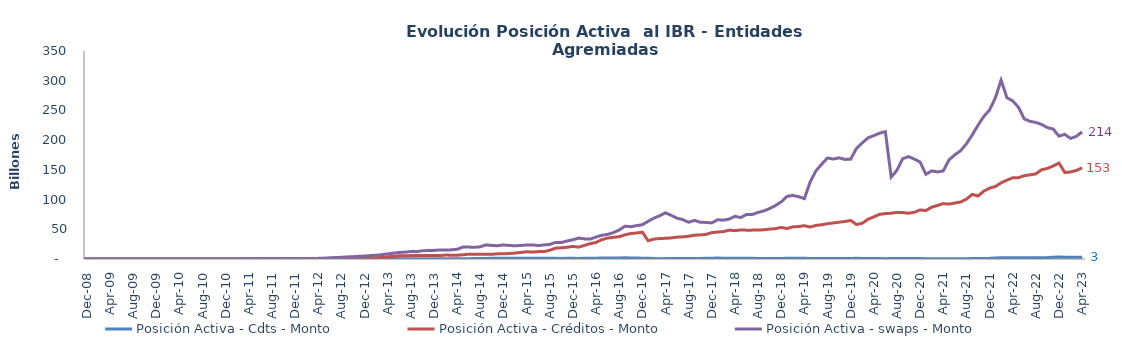
| Category | Posición Activa - Cdts - Monto | Posición Activa - Créditos - Monto | Posición Activa - swaps - Monto |
|---|---|---|---|
| 2008-07-01 | 0 | 0 | 0 |
| 2008-08-01 | 0 | 0 | 0 |
| 2008-09-01 | 0 | 0 | 0 |
| 2008-10-01 | 0 | 0 | 0 |
| 2008-11-01 | 0 | 0 | 0 |
| 2008-12-01 | 0 | 0 | 0 |
| 2009-01-01 | 0 | 0 | 0 |
| 2009-02-01 | 7428500000 | 0 | 0 |
| 2009-03-01 | 7428500000 | 0 | 0 |
| 2009-04-01 | 7428500000 | 0 | 0 |
| 2009-05-01 | 7428500000 | 0 | 0 |
| 2009-06-01 | 7428500000 | 0 | 0 |
| 2009-07-01 | 7428500000 | 0 | 0 |
| 2009-08-01 | 7428500000 | 0 | 0 |
| 2009-09-01 | 7428500000 | 0 | 0 |
| 2009-10-01 | 7928500000 | 0 | 0 |
| 2009-11-01 | 22928500000 | 0 | 0 |
| 2009-12-01 | 22928500000 | 0 | 0 |
| 2010-01-01 | 22928500000 | 0 | 400000000 |
| 2010-02-01 | 22928500000 | 0 | 400000000 |
| 2010-03-01 | 22928500000 | 0 | 1300000000 |
| 2010-04-01 | 22928500000 | 0 | 9300000000 |
| 2010-05-01 | 22928500000 | 0 | 24000000000 |
| 2010-06-01 | 22928500000 | 0 | 35000000000 |
| 2010-07-01 | 22928500000 | 0 | 49000000000 |
| 2010-08-01 | 15500000000 | 0 | 51000000000 |
| 2010-09-01 | 15500000000 | 0 | 42000000000 |
| 2010-10-01 | 62500000000 | 0 | 41000000000 |
| 2010-11-01 | 79500000000 | 0 | 29000000000 |
| 2010-12-01 | 81500000000 | 0 | 22000000000 |
| 2011-01-01 | 86000000000 | 0 | 23500000000 |
| 2011-02-01 | 134000000000 | 0 | 79500000000 |
| 2011-03-01 | 251400000000 | 0 | 114500000000 |
| 2011-04-01 | 282400000000 | 0 | 212500000000 |
| 2011-05-01 | 311900000000 | 0 | 246500000000 |
| 2011-06-01 | 450924000000 | 0 | 280500000000 |
| 2011-07-01 | 628924000000 | 0 | 307500000000 |
| 2011-08-01 | 650424000000 | 0 | 496500000000 |
| 2011-09-01 | 590324000000 | 0 | 493500000000 |
| 2011-10-01 | 571324000000 | 0 | 503000000000 |
| 2011-11-01 | 564354000000 | 0 | 357000000000 |
| 2011-12-01 | 573354000000 | 0 | 348000000000 |
| 2012-01-01 | 578854000000 | 0 | 368000000000 |
| 2012-02-01 | 569324000000 | 0 | 469000000000 |
| 2012-03-01 | 394324000000 | 0 | 708000000000 |
| 2012-04-01 | 362824000000 | 0 | 1052500000000 |
| 2012-05-01 | 425324000000 | 0 | 1321850000000 |
| 2012-06-01 | 472528000000 | 0 | 2131450000000 |
| 2012-07-01 | 467028000000 | 10736400932.6 | 2430450000000 |
| 2012-08-01 | 467028000000 | 395898409383.73 | 2831550000000 |
| 2012-09-01 | 514128000000 | 1278623915608.46 | 3465550000000 |
| 2012-10-01 | 528328000000 | 1409219995143.76 | 3916900000000 |
| 2012-11-01 | 503328000000 | 1739292606539.45 | 4543100000000 |
| 2012-12-01 | 538118000000 | 1753702085065.83 | 4921600000000 |
| 2013-01-01 | 612118000000 | 1860190799905.28 | 5800050000000 |
| 2013-02-01 | 567619540000 | 2113733072125.38 | 6318174692981 |
| 2013-03-01 | 626411310533 | 2638808537970.97 | 7322374692981 |
| 2013-04-01 | 629111310533 | 3794306574436.62 | 8687553692981 |
| 2013-05-01 | 639011310533 | 4443519152060.31 | 9853614804093 |
| 2013-06-01 | 579211310533 | 5441636414484 | 11004589051114 |
| 2013-07-01 | 619911310533 | 5276885903223 | 11472101064827 |
| 2013-08-01 | 264748310533 | 5793112373612 | 12500291064827 |
| 2013-09-01 | 235198310533 | 5781182186427 | 12379491064827 |
| 2013-10-01 | 287324065335 | 5721227676911.381 | 13896537064827 |
| 2013-11-01 | 330716307053.16 | 5769151414412.79 | 14219298533045 |
| 2013-12-01 | 351289281441 | 6033441138708.75 | 14497299602830 |
| 2014-01-01 | 415560557858 | 5904465606780.36 | 15189393602830 |
| 2014-02-01 | 421812163336 | 6592170750743.01 | 15247970102830 |
| 2014-03-01 | 398635445434 | 6454762439295.27 | 15371390390463 |
| 2014-04-01 | 505726541829 | 6413323429971.03 | 16452051310463 |
| 2014-05-01 | 522799425000 | 7069454807140.37 | 19992594629221.91 |
| 2014-06-01 | 617169430000 | 8104068718395.04 | 20048124203761.16 |
| 2014-07-01 | 680622729450 | 8165185122690.54 | 19722335424382.492 |
| 2014-08-01 | 756139827000 | 8078177412953.88 | 20517588213883 |
| 2014-09-01 | 938513426809.328 | 8003623952520.778 | 23817248811402.992 |
| 2014-10-01 | 1085627969999.998 | 8010472710623.305 | 22656264562178.992 |
| 2014-11-01 | 1356560691367.905 | 8724921587924.001 | 22396570950523 |
| 2014-12-01 | 1367078350000 | 8797305493724.32 | 23642742101498 |
| 2015-01-01 | 1293754500000 | 9263385595110.854 | 22764940027082.715 |
| 2015-02-01 | 1390322000000 | 10008403554124.396 | 22210507490027 |
| 2015-03-01 | 1291122000000 | 11056737501660.055 | 22789161192534.68 |
| 2015-04-01 | 1155322000000 | 12157445776599.592 | 23567227758727.7 |
| 2015-05-01 | 1089813000000 | 11714375535106.436 | 23774907278634.305 |
| 2015-06-01 | 1141513000000 | 12407392413540.484 | 22696018508157.156 |
| 2015-07-01 | 1269327666147 | 12421253163765.184 | 23667535655155.49 |
| 2015-08-01 | 1149827666147 | 14732094647912.19 | 24499865405155.484 |
| 2015-09-01 | 1094927666147 | 18275955310324.863 | 27906116302241.14 |
| 2015-10-01 | 986527666147 | 18878869867150.16 | 27759640112993.98 |
| 2015-11-01 | 1087027666147 | 19694520524655.047 | 30367137758015.98 |
| 2015-12-01 | 1081027666147 | 21192540679005.13 | 32342306254816.98 |
| 2016-01-01 | 1038064375438.43 | 19977514817492.54 | 35212979556095.375 |
| 2016-02-01 | 1068049372938.43 | 22902299660100.133 | 33822025975882.445 |
| 2016-03-01 | 1257396510438.43 | 25918368881639.652 | 33434779272390.047 |
| 2016-04-01 | 1145425000000 | 27903668641981.312 | 37046880484154.11 |
| 2016-05-01 | 1531395000000 | 32621114880164.73 | 39908396979761.27 |
| 2016-06-01 | 1705195000000 | 35183640497890.742 | 41366680595973.1 |
| 2016-07-01 | 1836308000000 | 36521841812503.32 | 44471316930976.79 |
| 2016-08-01 | 1870808000000 | 37465674066332.95 | 48816567034654.92 |
| 2016-09-01 | 1929687493130 | 40686213476757.7 | 55251579491117.45 |
| 2016-10-01 | 1882682961712 | 42864686598625.914 | 54309484290905.336 |
| 2016-11-01 | 1878248867176 | 43733971005961.09 | 56118948154012.44 |
| 2016-12-01 | 1468748425000 | 45151117036611.55 | 57699253311873.81 |
| 2017-01-01 | 1143108000000 | 30719580969277.98 | 63422656832652.35 |
| 2017-02-01 | 959983000000 | 33544129154349.8 | 68757567415515.25 |
| 2017-03-01 | 577051000000 | 34462812060371.684 | 72819778766690.34 |
| 2017-04-01 | 885158000000 | 34827145198479.086 | 77767325467809.62 |
| 2017-05-01 | 833037000000 | 35497786022672.44 | 73316207022947.58 |
| 2017-06-01 | 767212000000 | 36768829278716.77 | 68724115566899.586 |
| 2017-07-01 | 723063100000 | 37293790277269.41 | 66196996418075.26 |
| 2017-08-01 | 737198200000 | 38317542250005.2 | 61794201909898.49 |
| 2017-09-01 | 851825800000 | 40079477161418.875 | 64956887148155.3 |
| 2017-10-01 | 875668400000 | 40535657583816.695 | 61960974775715.3 |
| 2017-11-01 | 1217681607735 | 41397643384740.86 | 61523240467384.72 |
| 2017-12-01 | 1195773462000 | 44372983729678.305 | 60736713351879.72 |
| 2018-01-01 | 1486153000000 | 45316260145228 | 66047253084281.72 |
| 2018-02-01 | 1328803000000 | 46162206571708.07 | 65387773354256.72 |
| 2018-03-01 | 1305953000000 | 48453443068790.65 | 67190421317837.914 |
| 2018-04-01 | 1282453000000 | 47890324452343.98 | 71760271521781.73 |
| 2018-05-01 | 1171161000000 | 48725588703126.695 | 69749268129720.266 |
| 2018-06-01 | 1178361000000 | 48565406337446.484 | 74906865920231.27 |
| 2018-07-01 | 1147911000000 | 48583592953609.9 | 74953597215347.72 |
| 2018-08-01 | 974361000000 | 48739509325405.945 | 78336828076056.03 |
| 2018-09-01 | 880511000000 | 49155342171520.125 | 80926405096788.67 |
| 2018-10-01 | 906123269800 | 50329644979668.08 | 85000285327947.73 |
| 2018-11-01 | 935178269800 | 51067718130478.16 | 89917602044952.98 |
| 2018-12-01 | 983678269800 | 53154821210309.25 | 96170753499983.2 |
| 2019-01-01 | 1280276927898.07 | 51241611103004.125 | 105342711964485.36 |
| 2019-02-01 | 1317202390483.93 | 54060435828151.195 | 106871828205756.19 |
| 2019-03-01 | 1263773151583.71 | 54692666315083.05 | 104945975072707.31 |
| 2019-04-01 | 1246768411398 | 55991641247250.68 | 101579729933697.45 |
| 2019-05-01 | 1012341181800 | 53805320644815.23 | 129568137269667.69 |
| 2019-06-01 | 999138572800 | 56508944560043.25 | 148452268415643.94 |
| 2019-07-01 | 952207980300 | 57562475653317.766 | 159554889555444.84 |
| 2019-08-01 | 990963550348 | 59413925521552.75 | 170008456352171.3 |
| 2019-09-01 | 916745301648 | 60644336673555.46 | 168191675391740.5 |
| 2019-10-01 | 893433031848 | 61908575234728.445 | 170225602844305.4 |
| 2019-11-01 | 965433031848 | 63113224205513.6 | 167546382534157.9 |
| 2019-12-01 | 1006133031848 | 64853593354215.56 | 167987758390619.75 |
| 2020-01-01 | 1079446125000 | 58010103353918.32 | 186004869196381.56 |
| 2020-02-01 | 829796125000 | 60137915951775.9 | 195340422376457.97 |
| 2020-03-01 | 862796125000 | 66939453932101.55 | 203921731417590.47 |
| 2020-04-01 | 653796125000 | 70839317850460.5 | 207698598041562.5 |
| 2020-05-01 | 717881961000 | 75200345870257.08 | 211703508027395.56 |
| 2020-06-01 | 551381961000 | 76350094864651.17 | 214232790563987.9 |
| 2020-07-01 | 732005126000 | 77052532243836.34 | 137935629036431.1 |
| 2020-08-01 | 705505126000 | 78401962695625.83 | 149273833733936.2 |
| 2020-09-01 | 1010148909000 | 78142918579817.9 | 168848725800814.16 |
| 2020-10-01 | 967817581000 | 76999647869466.42 | 172288340571313.84 |
| 2020-11-01 | 1001498553000 | 78618040183756.48 | 168128513598030.06 |
| 2020-12-01 | 1001032058000 | 82596043059265.86 | 163231890936989.25 |
| 2021-01-01 | 465793000000 | 81474494757472.53 | 142506709533514.34 |
| 2021-02-01 | 436378831900 | 87222675341140.88 | 148285711117255.47 |
| 2021-03-01 | 419878831900 | 89996256390433.61 | 146517089028027.7 |
| 2021-04-01 | 334878831900 | 93241152970344.34 | 148190679497119.78 |
| 2021-05-01 | 370178831900 | 92313108870358.19 | 166860218885319.9 |
| 2021-06-01 | 534178831900 | 94169581147139.62 | 175311850917372.72 |
| 2021-07-01 | 524678831900 | 95953860251740.17 | 182157951610650.44 |
| 2021-08-01 | 592078831900 | 100604945538802.4 | 193801313326925.53 |
| 2021-09-01 | 635048391900 | 108694381205673.8 | 208549461904404.62 |
| 2021-10-01 | 787289659900 | 105992281263232.89 | 224887300206286.78 |
| 2021-11-01 | 982673022900 | 114122824274899.33 | 239756283503539 |
| 2021-12-01 | 1170297386900 | 119277110836853.69 | 250727224275290.56 |
| 2022-01-01 | 1626896873643 | 121969821085471.9 | 270932151383364.06 |
| 2022-02-01 | 2107942273000 | 128175282996127.44 | 300944052033170.2 |
| 2022-03-01 | 2174441973000 | 132634787509595.22 | 271460584143053.1 |
| 2022-04-01 | 2206880203000 | 136613496100353.1 | 266078948323886.84 |
| 2022-05-01 | 2271482003000 | 136788992541907.9 | 255325882763491.5 |
| 2022-06-01 | 2252979518000 | 140194652548534.8 | 235767638020874.2 |
| 2022-07-01 | 2199324853000 | 141581086068606.84 | 231651327861229.1 |
| 2022-08-01 | 2179286523000 | 143181642753435.97 | 229786526460560.88 |
| 2022-09-01 | 2295971336873.5 | 150220794736983.5 | 226356377569789.5 |
| 2022-10-01 | 2464607312636.83 | 152371094120182.06 | 221118788236778.38 |
| 2022-11-01 | 3013021761380.3 | 156537118884970.4 | 218650556437850.2 |
| 2022-12-01 | 3189214382406.6 | 161439137508734.1 | 206733653878113.53 |
| 2023-01-01 | 2895735147000 | 145644549340749.38 | 209793805437796.16 |
| 2023-02-01 | 3059877446731.5 | 146346859909836.22 | 202903871537638.53 |
| 2023-03-01 | 2775535506429.5 | 149015263949261.06 | 206440438688656.7 |
| 2023-04-01 | 2986977631960.5 | 153440565965807.88 | 213892116058046.3 |